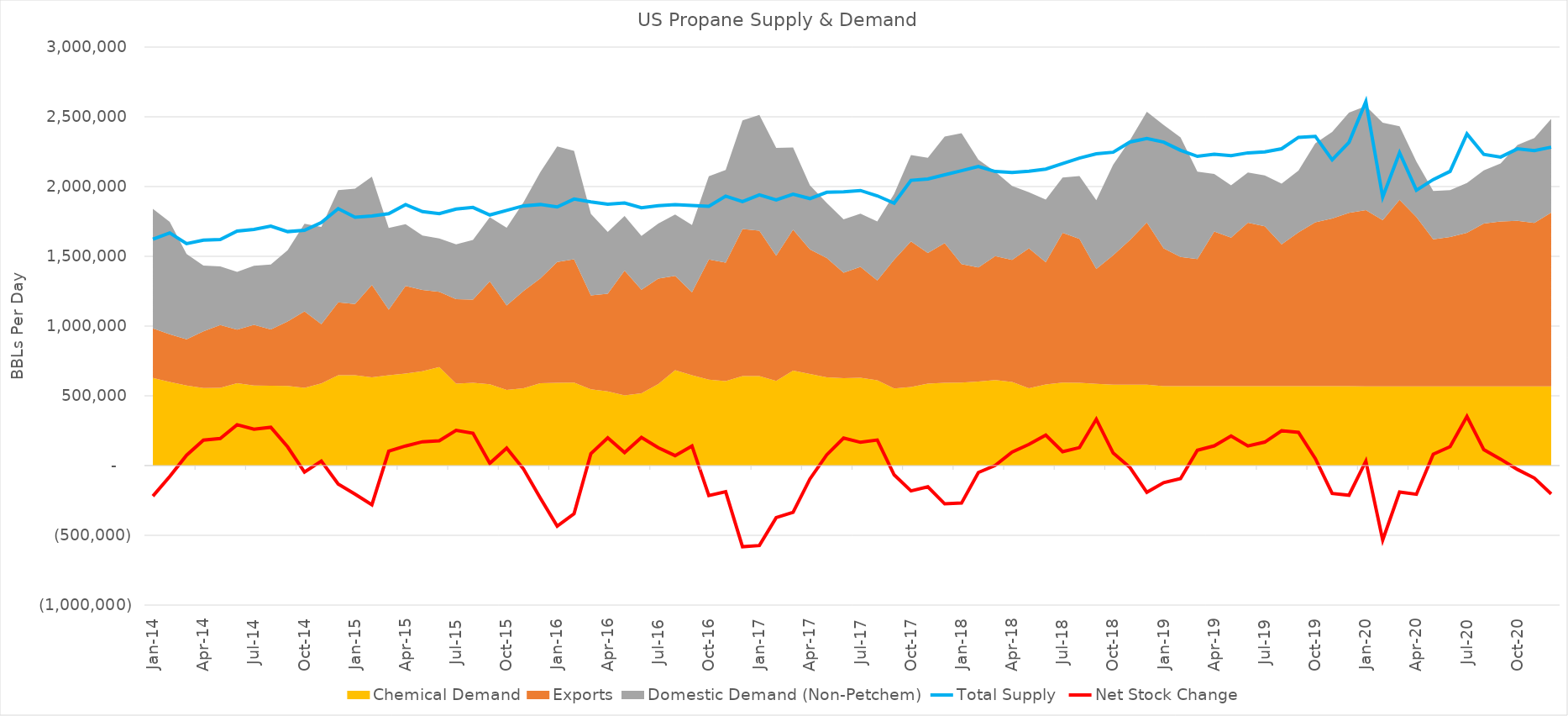
| Category | Total Supply  | Net Stock Change  |
|---|---|---|
| 2014-01-15 | 1622096.774 | -218812.004 |
| 2014-02-15 | 1667821.429 | -78513.781 |
| 2014-03-15 | 1591032.258 | 74364.262 |
| 2014-04-15 | 1615666.667 | 182207.802 |
| 2014-05-15 | 1620741.935 | 193736.502 |
| 2014-06-15 | 1681100 | 293050.86 |
| 2014-07-15 | 1692967.742 | 261088.504 |
| 2014-08-15 | 1716129.032 | 274528.162 |
| 2014-09-15 | 1677000 | 133607.39 |
| 2014-10-15 | 1686709.677 | -46792.743 |
| 2014-11-15 | 1742100 | 31982.998 |
| 2014-12-15 | 1841806.452 | -132653.105 |
| 2015-01-15 | 1780129.032 | -204661.372 |
| 2015-02-15 | 1789500 | -281201.886 |
| 2015-03-15 | 1805612.903 | 102788.25 |
| 2015-04-15 | 1870600 | 140352.809 |
| 2015-05-15 | 1820290.323 | 170704.641 |
| 2015-06-15 | 1806333.333 | 177689.058 |
| 2015-07-15 | 1838838.71 | 252485.588 |
| 2015-08-15 | 1850225.806 | 232166.674 |
| 2015-09-15 | 1796500 | 16077.309 |
| 2015-10-15 | 1829354.839 | 125142.748 |
| 2015-11-15 | 1862033.333 | -24429.85 |
| 2015-12-15 | 1871193.548 | -233155.946 |
| 2016-01-15 | 1854225.806 | -433807.116 |
| 2016-02-15 | 1910482.759 | -344954.67 |
| 2016-03-15 | 1890225.806 | 86050.25 |
| 2016-04-15 | 1873600 | 198952.211 |
| 2016-05-15 | 1882548.387 | 93436.076 |
| 2016-06-15 | 1848600 | 202097.179 |
| 2016-07-15 | 1862903.226 | 128000.653 |
| 2016-08-15 | 1870387.097 | 71346.679 |
| 2016-09-15 | 1864706.768 | 140225.543 |
| 2016-10-15 | 1858399.241 | -215469.31 |
| 2016-11-15 | 1931774.435 | -187649.831 |
| 2016-12-15 | 1892723.822 | -581602.206 |
| 2017-01-15 | 1940660.306 | -573193.799 |
| 2017-02-15 | 1903811.882 | -373222.104 |
| 2017-03-15 | 1945275.209 | -334968.793 |
| 2017-04-15 | 1913879.435 | -95813.261 |
| 2017-05-15 | 1959309.467 | 77208.867 |
| 2017-06-15 | 1962100 | 197463.175 |
| 2017-07-15 | 1971967.742 | 166694.729 |
| 2017-08-15 | 1933510.444 | 183314.166 |
| 2017-09-15 | 1881212.027 | -66547.321 |
| 2017-10-15 | 2044613.619 | -181194.289 |
| 2017-11-15 | 2054398.489 | -152314.362 |
| 2017-12-15 | 2084671.157 | -274333.4 |
| 2018-01-15 | 2113450.393 | -268758.608 |
| 2018-02-15 | 2143647.86 | -49639.725 |
| 2018-03-15 | 2108130.29 | 1712.803 |
| 2018-04-15 | 2101524.814 | 96421.608 |
| 2018-05-15 | 2110293.223 | 151703.929 |
| 2018-06-15 | 2125167.44 | 217850.972 |
| 2018-07-15 | 2164567.713 | 99130.761 |
| 2018-08-15 | 2203928.897 | 128939.214 |
| 2018-09-15 | 2234354.001 | 332504.369 |
| 2018-10-15 | 2246171.603 | 90221.547 |
| 2018-11-15 | 2319715.176 | -13701.306 |
| 2018-12-15 | 2344218.297 | -191915.327 |
| 2019-01-15 | 2318317.083 | -122504.961 |
| 2019-02-15 | 2259581.503 | -93176.86 |
| 2019-03-15 | 2216760.238 | 109840.337 |
| 2019-04-15 | 2231633.957 | 141391.928 |
| 2019-05-15 | 2221181.755 | 211980.343 |
| 2019-06-15 | 2241579.876 | 140112.921 |
| 2019-07-15 | 2248656.894 | 168353.503 |
| 2019-08-15 | 2271129.729 | 249706.075 |
| 2019-09-15 | 2352659.841 | 237907.813 |
| 2019-10-15 | 2360246.456 | 50171.903 |
| 2019-11-15 | 2192136.179 | -200035.022 |
| 2019-12-15 | 2317559.536 | -212379.812 |
| 2020-01-15 | 2609069.9 | 32087.635 |
| 2020-02-15 | 1924419.929 | -533448.857 |
| 2020-03-15 | 2242835.635 | -189964.436 |
| 2020-04-15 | 1973734.276 | -205757.772 |
| 2020-05-15 | 2050115.633 | 81619.511 |
| 2020-06-15 | 2108964.21 | 135270.112 |
| 2020-07-15 | 2377288.235 | 351899.891 |
| 2020-08-15 | 2230879.055 | 114193.548 |
| 2020-09-15 | 2211743.079 | 45850.003 |
| 2020-10-15 | 2270417.095 | -27963.016 |
| 2020-11-15 | 2258282.665 | -89368.04 |
| 2020-12-15 | 2282391.613 | -203082.877 |